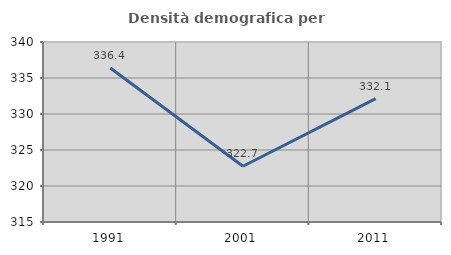
| Category | Densità demografica |
|---|---|
| 1991.0 | 336.4 |
| 2001.0 | 322.746 |
| 2011.0 | 332.133 |